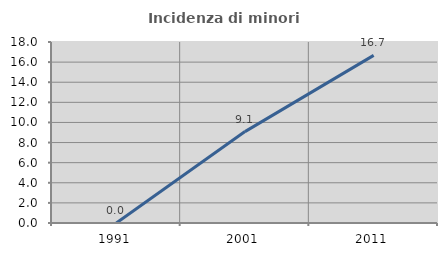
| Category | Incidenza di minori stranieri |
|---|---|
| 1991.0 | 0 |
| 2001.0 | 9.091 |
| 2011.0 | 16.667 |